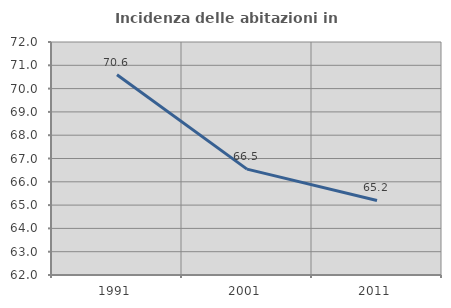
| Category | Incidenza delle abitazioni in proprietà  |
|---|---|
| 1991.0 | 70.598 |
| 2001.0 | 66.545 |
| 2011.0 | 65.2 |